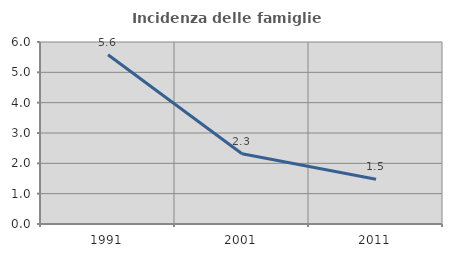
| Category | Incidenza delle famiglie numerose |
|---|---|
| 1991.0 | 5.582 |
| 2001.0 | 2.316 |
| 2011.0 | 1.473 |